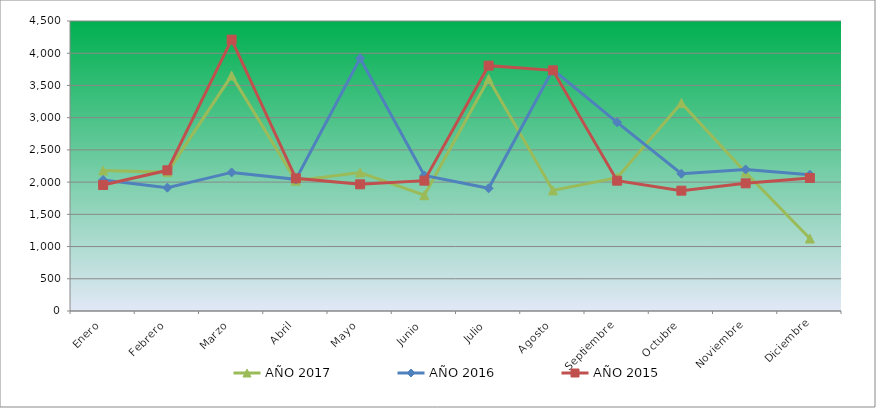
| Category | AÑO 2017 | AÑO 2016 | AÑO 2015 |
|---|---|---|---|
| Enero | 2180.976 | 2032.393 | 1955.306 |
| Febrero | 2154.314 | 1914.051 | 2182.908 |
| Marzo | 3652.735 | 2150.735 | 4210.633 |
| Abril | 2021.002 | 2042.684 | 2058.762 |
| Mayo | 2148.981 | 3920.718 | 1965.652 |
| Junio | 1797.039 | 2104.427 | 2022.552 |
| Julio | 3599.41 | 1903.761 | 3807.157 |
| Agosto | 1871.693 | 3745.778 | 3734.738 |
| Septiembre | 2068.994 | 2927.675 | 2022.552 |
| Octubre | 3226.138 | 2130.154 | 1867.369 |
| Noviembre | 2148.981 | 2197.043 | 1981.17 |
| Diciembre | 1125.149 | 2114.718 | 2063.934 |